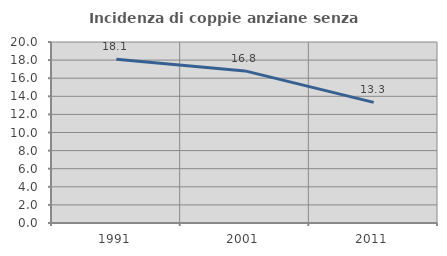
| Category | Incidenza di coppie anziane senza figli  |
|---|---|
| 1991.0 | 18.103 |
| 2001.0 | 16.807 |
| 2011.0 | 13.333 |